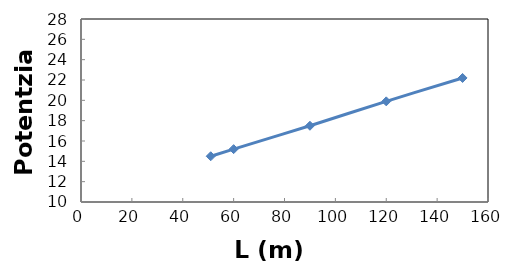
| Category | P (kW) |
|---|---|
| 51.0 | 14.5 |
| 60.0 | 15.2 |
| 90.0 | 17.5 |
| 120.0 | 19.9 |
| 150.0 | 22.2 |